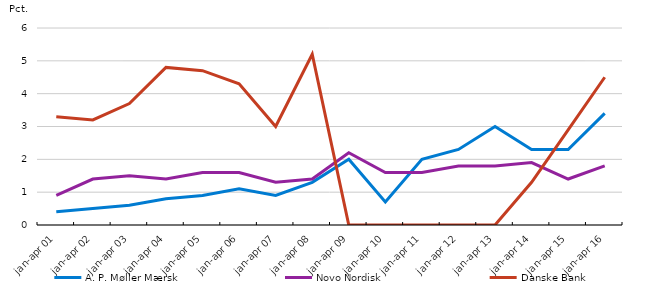
| Category | A. P. Møller Mærsk | Novo Nordisk | Danske Bank |
|---|---|---|---|
| jan-apr 01 | 0.4 | 0.9 | 3.3 |
| jan-apr 02 | 0.5 | 1.4 | 3.2 |
| jan-apr 03 | 0.6 | 1.5 | 3.7 |
| jan-apr 04 | 0.8 | 1.4 | 4.8 |
| jan-apr 05 | 0.9 | 1.6 | 4.7 |
| jan-apr 06 | 1.1 | 1.6 | 4.3 |
| jan-apr 07 | 0.9 | 1.3 | 3 |
| jan-apr 08 | 1.3 | 1.4 | 5.2 |
| jan-apr 09 | 2 | 2.2 | 0 |
| jan-apr 10 | 0.7 | 1.6 | 0 |
| jan-apr 11 | 2 | 1.6 | 0 |
| jan-apr 12 | 2.3 | 1.8 | 0 |
| jan-apr 13 | 3 | 1.8 | 0 |
| jan-apr 14 | 2.3 | 1.9 | 1.3 |
| jan-apr 15 | 2.3 | 1.4 | 2.9 |
| jan-apr 16 | 3.4 | 1.8 | 4.5 |